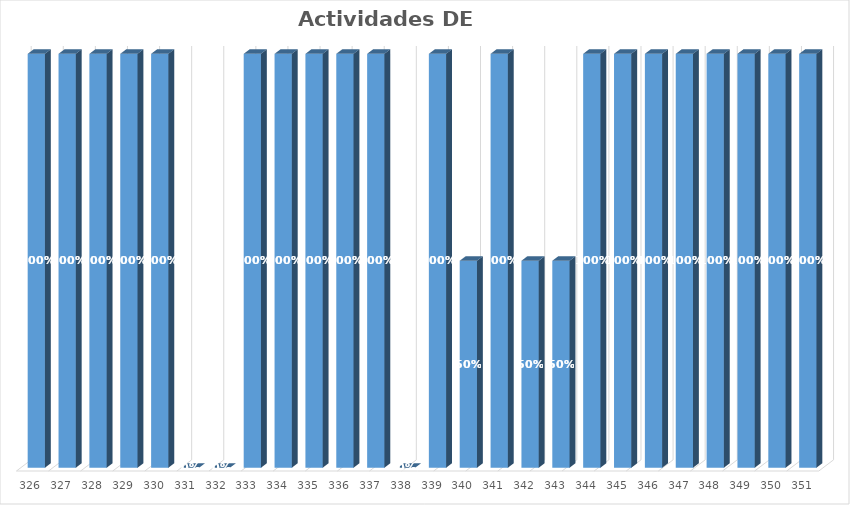
| Category | % Avance |
|---|---|
| 326.0 | 1 |
| 327.0 | 1 |
| 328.0 | 1 |
| 329.0 | 1 |
| 330.0 | 1 |
| 331.0 | 0 |
| 332.0 | 0 |
| 333.0 | 1 |
| 334.0 | 1 |
| 335.0 | 1 |
| 336.0 | 1 |
| 337.0 | 1 |
| 338.0 | 0 |
| 339.0 | 1 |
| 340.0 | 0.5 |
| 341.0 | 1 |
| 342.0 | 0.5 |
| 343.0 | 0.5 |
| 344.0 | 1 |
| 345.0 | 1 |
| 346.0 | 1 |
| 347.0 | 1 |
| 348.0 | 1 |
| 349.0 | 1 |
| 350.0 | 1 |
| 351.0 | 1 |